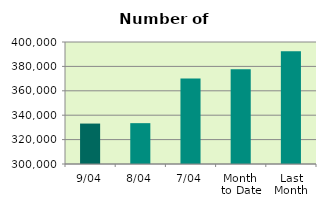
| Category | Series 0 |
|---|---|
| 9/04 | 333146 |
| 8/04 | 333478 |
| 7/04 | 370128 |
| Month 
to Date | 377687 |
| Last
Month | 392496.174 |